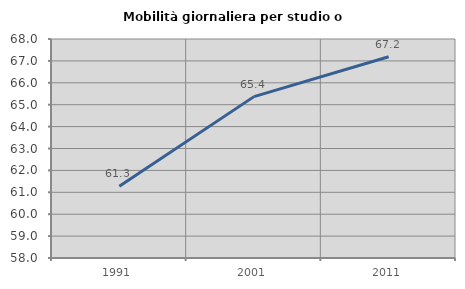
| Category | Mobilità giornaliera per studio o lavoro |
|---|---|
| 1991.0 | 61.279 |
| 2001.0 | 65.369 |
| 2011.0 | 67.187 |